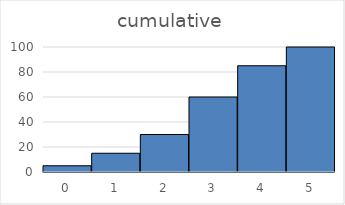
| Category | Series 0 |
|---|---|
| 0.0 | 5 |
| 1.0 | 15 |
| 2.0 | 30 |
| 3.0 | 60 |
| 4.0 | 85 |
| 5.0 | 100 |